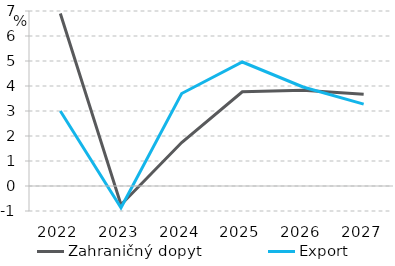
| Category | Zahraničný dopyt | Export |
|---|---|---|
| 2022.0 | 6.9 | 2.997 |
| 2023.0 | -0.75 | -0.869 |
| 2024.0 | 1.74 | 3.699 |
| 2025.0 | 3.77 | 4.959 |
| 2026.0 | 3.83 | 3.96 |
| 2027.0 | 3.67 | 3.276 |